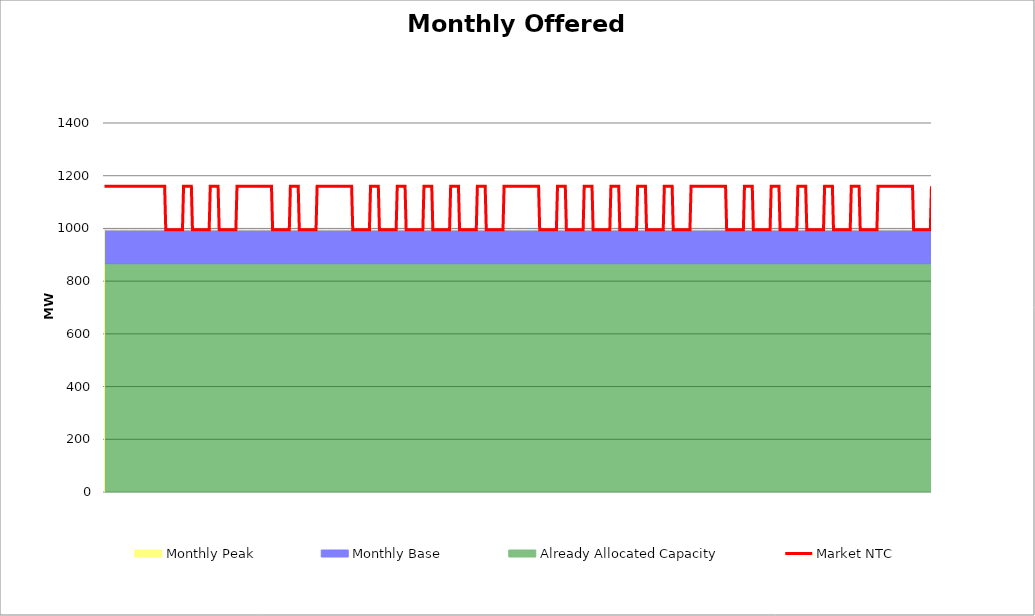
| Category | Market NTC |
|---|---|
| 0 | 1160 |
| 1 | 1160 |
| 2 | 1160 |
| 3 | 1160 |
| 4 | 1160 |
| 5 | 1160 |
| 6 | 1160 |
| 7 | 1160 |
| 8 | 1160 |
| 9 | 1160 |
| 10 | 1160 |
| 11 | 1160 |
| 12 | 1160 |
| 13 | 1160 |
| 14 | 1160 |
| 15 | 1160 |
| 16 | 1160 |
| 17 | 1160 |
| 18 | 1160 |
| 19 | 1160 |
| 20 | 1160 |
| 21 | 1160 |
| 22 | 1160 |
| 23 | 1160 |
| 24 | 1160 |
| 25 | 1160 |
| 26 | 1160 |
| 27 | 1160 |
| 28 | 1160 |
| 29 | 1160 |
| 30 | 1160 |
| 31 | 1160 |
| 32 | 1160 |
| 33 | 1160 |
| 34 | 1160 |
| 35 | 1160 |
| 36 | 1160 |
| 37 | 1160 |
| 38 | 1160 |
| 39 | 1160 |
| 40 | 1160 |
| 41 | 1160 |
| 42 | 1160 |
| 43 | 1160 |
| 44 | 1160 |
| 45 | 1160 |
| 46 | 1160 |
| 47 | 1160 |
| 48 | 1160 |
| 49 | 1160 |
| 50 | 1160 |
| 51 | 1160 |
| 52 | 1160 |
| 53 | 1160 |
| 54 | 1160 |
| 55 | 995 |
| 56 | 995 |
| 57 | 995 |
| 58 | 995 |
| 59 | 995 |
| 60 | 995 |
| 61 | 995 |
| 62 | 995 |
| 63 | 995 |
| 64 | 995 |
| 65 | 995 |
| 66 | 995 |
| 67 | 995 |
| 68 | 995 |
| 69 | 995 |
| 70 | 995 |
| 71 | 1160 |
| 72 | 1160 |
| 73 | 1160 |
| 74 | 1160 |
| 75 | 1160 |
| 76 | 1160 |
| 77 | 1160 |
| 78 | 1160 |
| 79 | 995 |
| 80 | 995 |
| 81 | 995 |
| 82 | 995 |
| 83 | 995 |
| 84 | 995 |
| 85 | 995 |
| 86 | 995 |
| 87 | 995 |
| 88 | 995 |
| 89 | 995 |
| 90 | 995 |
| 91 | 995 |
| 92 | 995 |
| 93 | 995 |
| 94 | 995 |
| 95 | 1160 |
| 96 | 1160 |
| 97 | 1160 |
| 98 | 1160 |
| 99 | 1160 |
| 100 | 1160 |
| 101 | 1160 |
| 102 | 1160 |
| 103 | 995 |
| 104 | 995 |
| 105 | 995 |
| 106 | 995 |
| 107 | 995 |
| 108 | 995 |
| 109 | 995 |
| 110 | 995 |
| 111 | 995 |
| 112 | 995 |
| 113 | 995 |
| 114 | 995 |
| 115 | 995 |
| 116 | 995 |
| 117 | 995 |
| 118 | 995 |
| 119 | 1160 |
| 120 | 1160 |
| 121 | 1160 |
| 122 | 1160 |
| 123 | 1160 |
| 124 | 1160 |
| 125 | 1160 |
| 126 | 1160 |
| 127 | 1160 |
| 128 | 1160 |
| 129 | 1160 |
| 130 | 1160 |
| 131 | 1160 |
| 132 | 1160 |
| 133 | 1160 |
| 134 | 1160 |
| 135 | 1160 |
| 136 | 1160 |
| 137 | 1160 |
| 138 | 1160 |
| 139 | 1160 |
| 140 | 1160 |
| 141 | 1160 |
| 142 | 1160 |
| 143 | 1160 |
| 144 | 1160 |
| 145 | 1160 |
| 146 | 1160 |
| 147 | 1160 |
| 148 | 1160 |
| 149 | 1160 |
| 150 | 1160 |
| 151 | 995 |
| 152 | 995 |
| 153 | 995 |
| 154 | 995 |
| 155 | 995 |
| 156 | 995 |
| 157 | 995 |
| 158 | 995 |
| 159 | 995 |
| 160 | 995 |
| 161 | 995 |
| 162 | 995 |
| 163 | 995 |
| 164 | 995 |
| 165 | 995 |
| 166 | 995 |
| 167 | 1160 |
| 168 | 1160 |
| 169 | 1160 |
| 170 | 1160 |
| 171 | 1160 |
| 172 | 1160 |
| 173 | 1160 |
| 174 | 1160 |
| 175 | 995 |
| 176 | 995 |
| 177 | 995 |
| 178 | 995 |
| 179 | 995 |
| 180 | 995 |
| 181 | 995 |
| 182 | 995 |
| 183 | 995 |
| 184 | 995 |
| 185 | 995 |
| 186 | 995 |
| 187 | 995 |
| 188 | 995 |
| 189 | 995 |
| 190 | 995 |
| 191 | 1160 |
| 192 | 1160 |
| 193 | 1160 |
| 194 | 1160 |
| 195 | 1160 |
| 196 | 1160 |
| 197 | 1160 |
| 198 | 1160 |
| 199 | 1160 |
| 200 | 1160 |
| 201 | 1160 |
| 202 | 1160 |
| 203 | 1160 |
| 204 | 1160 |
| 205 | 1160 |
| 206 | 1160 |
| 207 | 1160 |
| 208 | 1160 |
| 209 | 1160 |
| 210 | 1160 |
| 211 | 1160 |
| 212 | 1160 |
| 213 | 1160 |
| 214 | 1160 |
| 215 | 1160 |
| 216 | 1160 |
| 217 | 1160 |
| 218 | 1160 |
| 219 | 1160 |
| 220 | 1160 |
| 221 | 1160 |
| 222 | 1160 |
| 223 | 995 |
| 224 | 995 |
| 225 | 995 |
| 226 | 995 |
| 227 | 995 |
| 228 | 995 |
| 229 | 995 |
| 230 | 995 |
| 231 | 995 |
| 232 | 995 |
| 233 | 995 |
| 234 | 995 |
| 235 | 995 |
| 236 | 995 |
| 237 | 995 |
| 238 | 995 |
| 239 | 1160 |
| 240 | 1160 |
| 241 | 1160 |
| 242 | 1160 |
| 243 | 1160 |
| 244 | 1160 |
| 245 | 1160 |
| 246 | 1160 |
| 247 | 995 |
| 248 | 995 |
| 249 | 995 |
| 250 | 995 |
| 251 | 995 |
| 252 | 995 |
| 253 | 995 |
| 254 | 995 |
| 255 | 995 |
| 256 | 995 |
| 257 | 995 |
| 258 | 995 |
| 259 | 995 |
| 260 | 995 |
| 261 | 995 |
| 262 | 995 |
| 263 | 1160 |
| 264 | 1160 |
| 265 | 1160 |
| 266 | 1160 |
| 267 | 1160 |
| 268 | 1160 |
| 269 | 1160 |
| 270 | 1160 |
| 271 | 995 |
| 272 | 995 |
| 273 | 995 |
| 274 | 995 |
| 275 | 995 |
| 276 | 995 |
| 277 | 995 |
| 278 | 995 |
| 279 | 995 |
| 280 | 995 |
| 281 | 995 |
| 282 | 995 |
| 283 | 995 |
| 284 | 995 |
| 285 | 995 |
| 286 | 995 |
| 287 | 1160 |
| 288 | 1160 |
| 289 | 1160 |
| 290 | 1160 |
| 291 | 1160 |
| 292 | 1160 |
| 293 | 1160 |
| 294 | 1160 |
| 295 | 995 |
| 296 | 995 |
| 297 | 995 |
| 298 | 995 |
| 299 | 995 |
| 300 | 995 |
| 301 | 995 |
| 302 | 995 |
| 303 | 995 |
| 304 | 995 |
| 305 | 995 |
| 306 | 995 |
| 307 | 995 |
| 308 | 995 |
| 309 | 995 |
| 310 | 995 |
| 311 | 1160 |
| 312 | 1160 |
| 313 | 1160 |
| 314 | 1160 |
| 315 | 1160 |
| 316 | 1160 |
| 317 | 1160 |
| 318 | 1160 |
| 319 | 995 |
| 320 | 995 |
| 321 | 995 |
| 322 | 995 |
| 323 | 995 |
| 324 | 995 |
| 325 | 995 |
| 326 | 995 |
| 327 | 995 |
| 328 | 995 |
| 329 | 995 |
| 330 | 995 |
| 331 | 995 |
| 332 | 995 |
| 333 | 995 |
| 334 | 995 |
| 335 | 1160 |
| 336 | 1160 |
| 337 | 1160 |
| 338 | 1160 |
| 339 | 1160 |
| 340 | 1160 |
| 341 | 1160 |
| 342 | 1160 |
| 343 | 995 |
| 344 | 995 |
| 345 | 995 |
| 346 | 995 |
| 347 | 995 |
| 348 | 995 |
| 349 | 995 |
| 350 | 995 |
| 351 | 995 |
| 352 | 995 |
| 353 | 995 |
| 354 | 995 |
| 355 | 995 |
| 356 | 995 |
| 357 | 995 |
| 358 | 995 |
| 359 | 1160 |
| 360 | 1160 |
| 361 | 1160 |
| 362 | 1160 |
| 363 | 1160 |
| 364 | 1160 |
| 365 | 1160 |
| 366 | 1160 |
| 367 | 1160 |
| 368 | 1160 |
| 369 | 1160 |
| 370 | 1160 |
| 371 | 1160 |
| 372 | 1160 |
| 373 | 1160 |
| 374 | 1160 |
| 375 | 1160 |
| 376 | 1160 |
| 377 | 1160 |
| 378 | 1160 |
| 379 | 1160 |
| 380 | 1160 |
| 381 | 1160 |
| 382 | 1160 |
| 383 | 1160 |
| 384 | 1160 |
| 385 | 1160 |
| 386 | 1160 |
| 387 | 1160 |
| 388 | 1160 |
| 389 | 1160 |
| 390 | 1160 |
| 391 | 995 |
| 392 | 995 |
| 393 | 995 |
| 394 | 995 |
| 395 | 995 |
| 396 | 995 |
| 397 | 995 |
| 398 | 995 |
| 399 | 995 |
| 400 | 995 |
| 401 | 995 |
| 402 | 995 |
| 403 | 995 |
| 404 | 995 |
| 405 | 995 |
| 406 | 995 |
| 407 | 1160 |
| 408 | 1160 |
| 409 | 1160 |
| 410 | 1160 |
| 411 | 1160 |
| 412 | 1160 |
| 413 | 1160 |
| 414 | 1160 |
| 415 | 995 |
| 416 | 995 |
| 417 | 995 |
| 418 | 995 |
| 419 | 995 |
| 420 | 995 |
| 421 | 995 |
| 422 | 995 |
| 423 | 995 |
| 424 | 995 |
| 425 | 995 |
| 426 | 995 |
| 427 | 995 |
| 428 | 995 |
| 429 | 995 |
| 430 | 995 |
| 431 | 1160 |
| 432 | 1160 |
| 433 | 1160 |
| 434 | 1160 |
| 435 | 1160 |
| 436 | 1160 |
| 437 | 1160 |
| 438 | 1160 |
| 439 | 995 |
| 440 | 995 |
| 441 | 995 |
| 442 | 995 |
| 443 | 995 |
| 444 | 995 |
| 445 | 995 |
| 446 | 995 |
| 447 | 995 |
| 448 | 995 |
| 449 | 995 |
| 450 | 995 |
| 451 | 995 |
| 452 | 995 |
| 453 | 995 |
| 454 | 995 |
| 455 | 1160 |
| 456 | 1160 |
| 457 | 1160 |
| 458 | 1160 |
| 459 | 1160 |
| 460 | 1160 |
| 461 | 1160 |
| 462 | 1160 |
| 463 | 995 |
| 464 | 995 |
| 465 | 995 |
| 466 | 995 |
| 467 | 995 |
| 468 | 995 |
| 469 | 995 |
| 470 | 995 |
| 471 | 995 |
| 472 | 995 |
| 473 | 995 |
| 474 | 995 |
| 475 | 995 |
| 476 | 995 |
| 477 | 995 |
| 478 | 995 |
| 479 | 1160 |
| 480 | 1160 |
| 481 | 1160 |
| 482 | 1160 |
| 483 | 1160 |
| 484 | 1160 |
| 485 | 1160 |
| 486 | 1160 |
| 487 | 995 |
| 488 | 995 |
| 489 | 995 |
| 490 | 995 |
| 491 | 995 |
| 492 | 995 |
| 493 | 995 |
| 494 | 995 |
| 495 | 995 |
| 496 | 995 |
| 497 | 995 |
| 498 | 995 |
| 499 | 995 |
| 500 | 995 |
| 501 | 995 |
| 502 | 995 |
| 503 | 1160 |
| 504 | 1160 |
| 505 | 1160 |
| 506 | 1160 |
| 507 | 1160 |
| 508 | 1160 |
| 509 | 1160 |
| 510 | 1160 |
| 511 | 995 |
| 512 | 995 |
| 513 | 995 |
| 514 | 995 |
| 515 | 995 |
| 516 | 995 |
| 517 | 995 |
| 518 | 995 |
| 519 | 995 |
| 520 | 995 |
| 521 | 995 |
| 522 | 995 |
| 523 | 995 |
| 524 | 995 |
| 525 | 995 |
| 526 | 995 |
| 527 | 1160 |
| 528 | 1160 |
| 529 | 1160 |
| 530 | 1160 |
| 531 | 1160 |
| 532 | 1160 |
| 533 | 1160 |
| 534 | 1160 |
| 535 | 1160 |
| 536 | 1160 |
| 537 | 1160 |
| 538 | 1160 |
| 539 | 1160 |
| 540 | 1160 |
| 541 | 1160 |
| 542 | 1160 |
| 543 | 1160 |
| 544 | 1160 |
| 545 | 1160 |
| 546 | 1160 |
| 547 | 1160 |
| 548 | 1160 |
| 549 | 1160 |
| 550 | 1160 |
| 551 | 1160 |
| 552 | 1160 |
| 553 | 1160 |
| 554 | 1160 |
| 555 | 1160 |
| 556 | 1160 |
| 557 | 1160 |
| 558 | 1160 |
| 559 | 995 |
| 560 | 995 |
| 561 | 995 |
| 562 | 995 |
| 563 | 995 |
| 564 | 995 |
| 565 | 995 |
| 566 | 995 |
| 567 | 995 |
| 568 | 995 |
| 569 | 995 |
| 570 | 995 |
| 571 | 995 |
| 572 | 995 |
| 573 | 995 |
| 574 | 995 |
| 575 | 1160 |
| 576 | 1160 |
| 577 | 1160 |
| 578 | 1160 |
| 579 | 1160 |
| 580 | 1160 |
| 581 | 1160 |
| 582 | 1160 |
| 583 | 995 |
| 584 | 995 |
| 585 | 995 |
| 586 | 995 |
| 587 | 995 |
| 588 | 995 |
| 589 | 995 |
| 590 | 995 |
| 591 | 995 |
| 592 | 995 |
| 593 | 995 |
| 594 | 995 |
| 595 | 995 |
| 596 | 995 |
| 597 | 995 |
| 598 | 995 |
| 599 | 1160 |
| 600 | 1160 |
| 601 | 1160 |
| 602 | 1160 |
| 603 | 1160 |
| 604 | 1160 |
| 605 | 1160 |
| 606 | 1160 |
| 607 | 995 |
| 608 | 995 |
| 609 | 995 |
| 610 | 995 |
| 611 | 995 |
| 612 | 995 |
| 613 | 995 |
| 614 | 995 |
| 615 | 995 |
| 616 | 995 |
| 617 | 995 |
| 618 | 995 |
| 619 | 995 |
| 620 | 995 |
| 621 | 995 |
| 622 | 995 |
| 623 | 1160 |
| 624 | 1160 |
| 625 | 1160 |
| 626 | 1160 |
| 627 | 1160 |
| 628 | 1160 |
| 629 | 1160 |
| 630 | 1160 |
| 631 | 995 |
| 632 | 995 |
| 633 | 995 |
| 634 | 995 |
| 635 | 995 |
| 636 | 995 |
| 637 | 995 |
| 638 | 995 |
| 639 | 995 |
| 640 | 995 |
| 641 | 995 |
| 642 | 995 |
| 643 | 995 |
| 644 | 995 |
| 645 | 995 |
| 646 | 995 |
| 647 | 1160 |
| 648 | 1160 |
| 649 | 1160 |
| 650 | 1160 |
| 651 | 1160 |
| 652 | 1160 |
| 653 | 1160 |
| 654 | 1160 |
| 655 | 995 |
| 656 | 995 |
| 657 | 995 |
| 658 | 995 |
| 659 | 995 |
| 660 | 995 |
| 661 | 995 |
| 662 | 995 |
| 663 | 995 |
| 664 | 995 |
| 665 | 995 |
| 666 | 995 |
| 667 | 995 |
| 668 | 995 |
| 669 | 995 |
| 670 | 995 |
| 671 | 1160 |
| 672 | 1160 |
| 673 | 1160 |
| 674 | 1160 |
| 675 | 1160 |
| 676 | 1160 |
| 677 | 1160 |
| 678 | 1160 |
| 679 | 995 |
| 680 | 995 |
| 681 | 995 |
| 682 | 995 |
| 683 | 995 |
| 684 | 995 |
| 685 | 995 |
| 686 | 995 |
| 687 | 995 |
| 688 | 995 |
| 689 | 995 |
| 690 | 995 |
| 691 | 995 |
| 692 | 995 |
| 693 | 995 |
| 694 | 995 |
| 695 | 1160 |
| 696 | 1160 |
| 697 | 1160 |
| 698 | 1160 |
| 699 | 1160 |
| 700 | 1160 |
| 701 | 1160 |
| 702 | 1160 |
| 703 | 1160 |
| 704 | 1160 |
| 705 | 1160 |
| 706 | 1160 |
| 707 | 1160 |
| 708 | 1160 |
| 709 | 1160 |
| 710 | 1160 |
| 711 | 1160 |
| 712 | 1160 |
| 713 | 1160 |
| 714 | 1160 |
| 715 | 1160 |
| 716 | 1160 |
| 717 | 1160 |
| 718 | 1160 |
| 719 | 1160 |
| 720 | 1160 |
| 721 | 1160 |
| 722 | 1160 |
| 723 | 1160 |
| 724 | 1160 |
| 725 | 1160 |
| 726 | 1160 |
| 727 | 995 |
| 728 | 995 |
| 729 | 995 |
| 730 | 995 |
| 731 | 995 |
| 732 | 995 |
| 733 | 995 |
| 734 | 995 |
| 735 | 995 |
| 736 | 995 |
| 737 | 995 |
| 738 | 995 |
| 739 | 995 |
| 740 | 995 |
| 741 | 995 |
| 742 | 995 |
| 743 | 1160 |